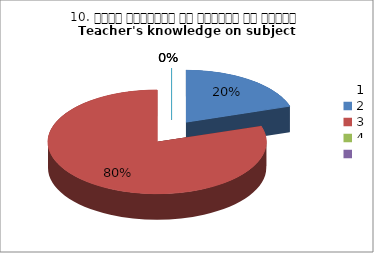
| Category | 10. विषय अवधारणा पर शिक्षक का ज्ञान
Teacher's knowledge on subject concept?
 |
|---|---|
| 0 | 1 |
| 1 | 4 |
| 2 | 0 |
| 3 | 0 |
| 4 | 0 |